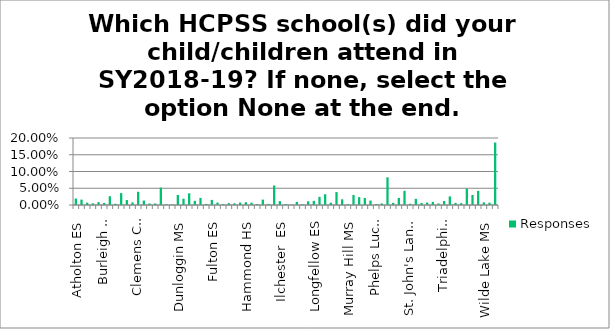
| Category | Responses |
|---|---|
| Atholton ES | 0.019 |
| Atholton HS | 0.016 |
| Bellows Spring ES | 0.007 |
| Bollman Bridge ES | 0.005 |
| Bonnie Branch MS | 0.009 |
| Bryant Woods ES | 0.006 |
| Burleigh Manor MS | 0.026 |
| Bushy Park ES | 0.004 |
| Centennial HS | 0.035 |
| Centennial Lane ES | 0.015 |
| Clarksville ES | 0.008 |
| Clarksville MS | 0.04 |
| Clemens Crossing ES | 0.013 |
| Cradlerock ES | 0.005 |
| Lake Elkhorn MS | 0.005 |
| Dayton Oaks ES | 0.052 |
| Deep Run ES | 0.002 |
| Ducketts Lane ES | 0.002 |
| Dunloggin MS | 0.03 |
| Elkridge ES | 0.019 |
| Elkridge Landing MS | 0.035 |
| Ellicott Mills MS | 0.012 |
| Folly Quarter  MS | 0.021 |
| Forest Ridge ES | 0.003 |
| Fulton ES | 0.015 |
| Glenelg HS | 0.007 |
| Glenwood  MS | 0.002 |
| Gorman Crossing ES | 0.006 |
| Guilford ES | 0.005 |
| Hammond ES | 0.007 |
| Hammond HS | 0.008 |
| Hammond MS | 0.007 |
| Hanover Hills ES | 0.003 |
| Harper's Choice MS | 0.016 |
| Hollifield Station ES | 0.003 |
| Howard  HS | 0.058 |
| Ilchester  ES | 0.012 |
| Jeffers Hill ES | 0.003 |
| Laurel Woods ES | 0.001 |
| Lime Kiln MS | 0.009 |
| Lisbon ES | 0.002 |
| Long Reach HS | 0.011 |
| Longfellow ES | 0.012 |
| Manor Woods ES | 0.024 |
| Marriotts Ridge HS | 0.032 |
| Mayfield Woods MS | 0.007 |
| Mount View MS | 0.039 |
| Mt. Hebron HS | 0.017 |
| Murray Hill MS | 0.003 |
| Northfield ES | 0.03 |
| Oakland Mills HS | 0.023 |
| Oakland Mills MS | 0.021 |
| Patapsco MS | 0.013 |
| Patuxent Valley MS | 0.003 |
| Phelps Luck ES | 0.005 |
| Pointers Run ES | 0.083 |
| Reservoir HS | 0.006 |
| River Hill HS | 0.021 |
| Rockburn ES | 0.042 |
| Running Brook ES | 0.004 |
| St. John's Lane ES | 0.018 |
| Stevens Forest ES | 0.006 |
| Swansfield ES | 0.007 |
| Talbott Springs ES | 0.009 |
| Thomas Viaduct MS | 0.005 |
| Thunder Hill ES | 0.012 |
| Triadelphia Ridge ES | 0.026 |
| Veterans ES | 0.006 |
| Waterloo ES | 0.006 |
| Waverly ES | 0.049 |
| West Friendship ES | 0.03 |
| Wilde Lake HS | 0.042 |
| Wilde Lake MS | 0.008 |
| Worthington ES | 0.007 |
| None | 0.186 |